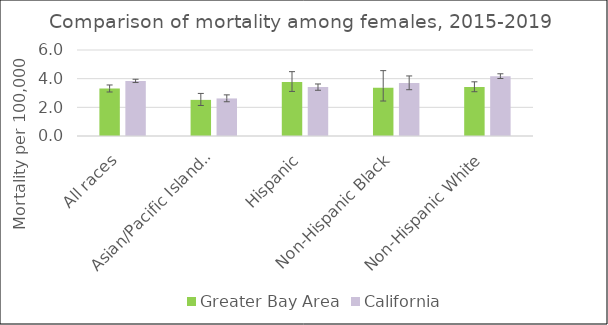
| Category | Greater Bay Area | California | US Mortality |
|---|---|---|---|
| All races | 3.31 | 3.84 |  |
| Asian/Pacific Islander | 2.52 | 2.62 |  |
| Hispanic | 3.76 | 3.41 |  |
| Non-Hispanic Black | 3.37 | 3.69 |  |
| Non-Hispanic White | 3.42 | 4.17 |  |